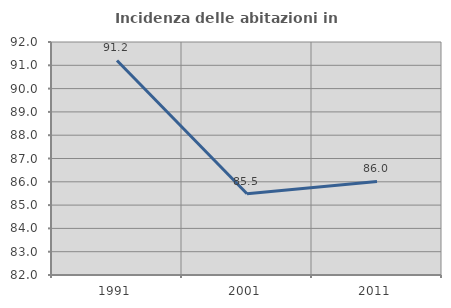
| Category | Incidenza delle abitazioni in proprietà  |
|---|---|
| 1991.0 | 91.209 |
| 2001.0 | 85.484 |
| 2011.0 | 86.017 |